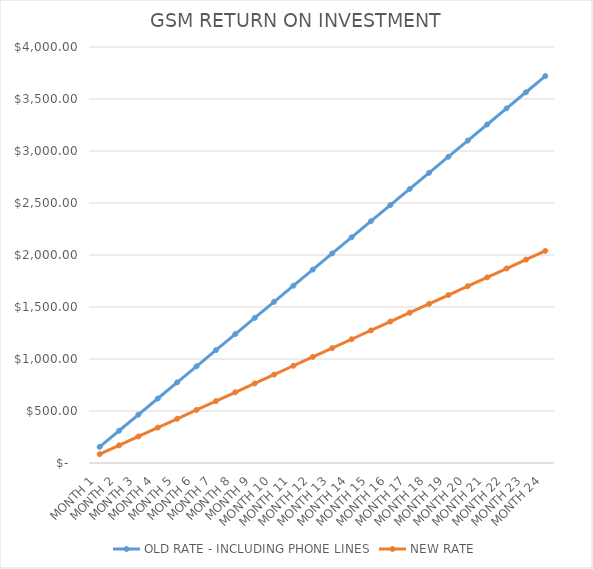
| Category | OLD RATE - INCLUDING PHONE LINES | NEW RATE |
|---|---|---|
| MONTH 1 | 155 | 85 |
| MONTH 2 | 310 | 170 |
| MONTH 3 | 465 | 255 |
| MONTH 4 | 620 | 340 |
| MONTH 5 | 775 | 425 |
| MONTH 6 | 930 | 510 |
| MONTH 7 | 1085 | 595 |
| MONTH 8 | 1240 | 680 |
| MONTH 9 | 1395 | 765 |
| MONTH 10 | 1550 | 850 |
| MONTH 11 | 1705 | 935 |
| MONTH 12 | 1860 | 1020 |
| MONTH 13 | 2015 | 1105 |
| MONTH 14 | 2170 | 1190 |
| MONTH 15 | 2325 | 1275 |
| MONTH 16 | 2480 | 1360 |
| MONTH 17 | 2635 | 1445 |
| MONTH 18 | 2790 | 1530 |
| MONTH 19 | 2945 | 1615 |
| MONTH 20 | 3100 | 1700 |
| MONTH 21 | 3255 | 1785 |
| MONTH 22 | 3410 | 1870 |
| MONTH 23 | 3565 | 1955 |
| MONTH 24 | 3720 | 2040 |